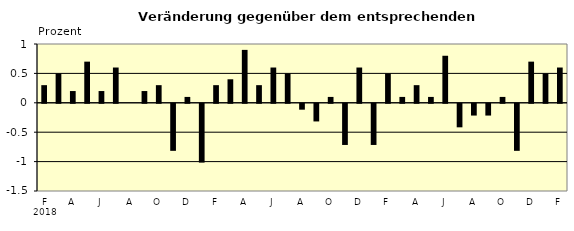
| Category | Series 0 |
|---|---|
| 0 | 0.3 |
| 1 | 0.5 |
| 2 | 0.2 |
| 3 | 0.7 |
| 4 | 0.2 |
| 5 | 0.6 |
| 6 | 0 |
| 7 | 0.2 |
| 8 | 0.3 |
| 9 | -0.8 |
| 10 | 0.1 |
| 11 | -1 |
| 12 | 0.3 |
| 13 | 0.4 |
| 14 | 0.9 |
| 15 | 0.3 |
| 16 | 0.6 |
| 17 | 0.5 |
| 18 | -0.1 |
| 19 | -0.3 |
| 20 | 0.1 |
| 21 | -0.7 |
| 22 | 0.6 |
| 23 | -0.7 |
| 24 | 0.5 |
| 25 | 0.1 |
| 26 | 0.3 |
| 27 | 0.1 |
| 28 | 0.8 |
| 29 | -0.4 |
| 30 | -0.2 |
| 31 | -0.2 |
| 32 | 0.1 |
| 33 | -0.8 |
| 34 | 0.7 |
| 35 | 0.5 |
| 36 | 0.6 |